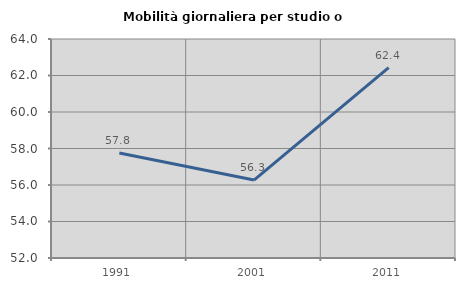
| Category | Mobilità giornaliera per studio o lavoro |
|---|---|
| 1991.0 | 57.759 |
| 2001.0 | 56.27 |
| 2011.0 | 62.427 |